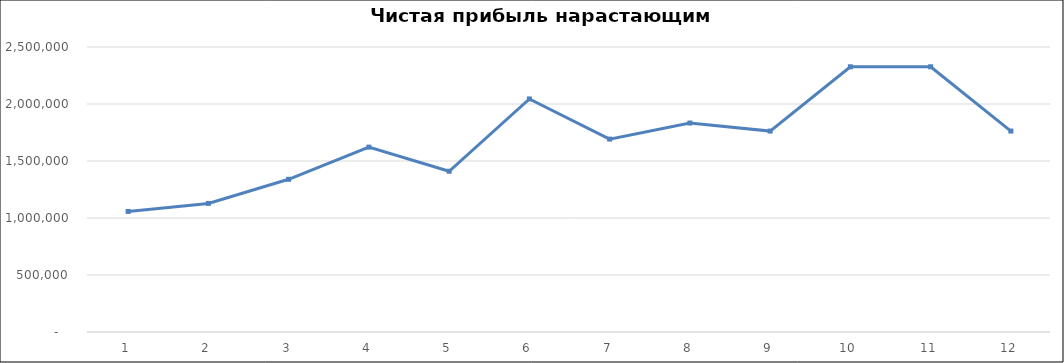
| Category | Series 0 |
|---|---|
| 0 | 1057500 |
| 1 | 1128000 |
| 2 | 1339500 |
| 3 | 1621500 |
| 4 | 1410000 |
| 5 | 2044500 |
| 6 | 1692000 |
| 7 | 1833000 |
| 8 | 1762500 |
| 9 | 2326500 |
| 10 | 2326500 |
| 11 | 1762500 |